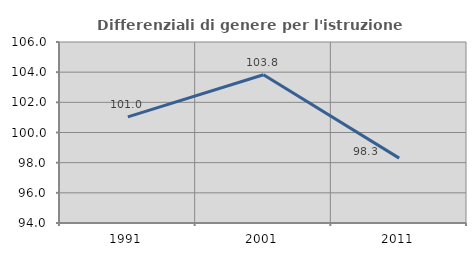
| Category | Differenziali di genere per l'istruzione superiore |
|---|---|
| 1991.0 | 101.034 |
| 2001.0 | 103.832 |
| 2011.0 | 98.301 |